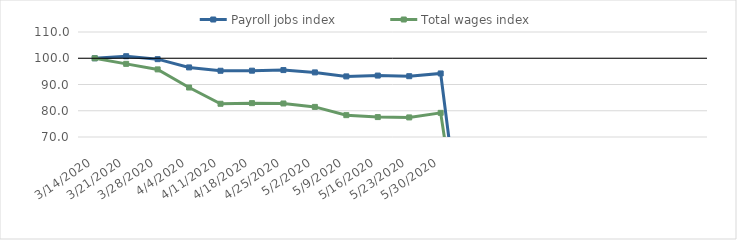
| Category | Payroll jobs index | Total wages index |
|---|---|---|
| 14/03/2020 | 100 | 100 |
| 21/03/2020 | 100.772 | 97.864 |
| 28/03/2020 | 99.652 | 95.753 |
| 04/04/2020 | 96.507 | 88.849 |
| 11/04/2020 | 95.235 | 82.656 |
| 18/04/2020 | 95.263 | 82.894 |
| 25/04/2020 | 95.493 | 82.769 |
| 02/05/2020 | 94.611 | 81.466 |
| 09/05/2020 | 93.089 | 78.318 |
| 16/05/2020 | 93.4 | 77.589 |
| 23/05/2020 | 93.163 | 77.459 |
| 30/05/2020 | 94.211 | 79.199 |